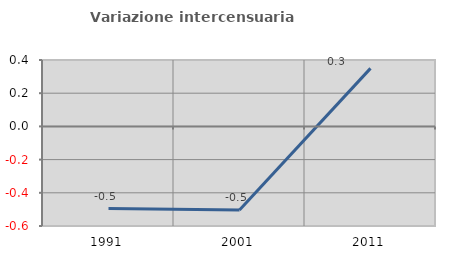
| Category | Variazione intercensuaria annua |
|---|---|
| 1991.0 | -0.495 |
| 2001.0 | -0.504 |
| 2011.0 | 0.35 |